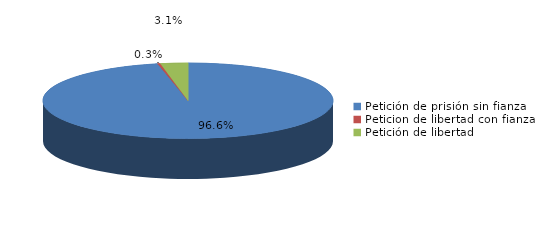
| Category | Series 0 |
|---|---|
| Petición de prisión sin fianza | 600 |
| Peticion de libertad con fianza | 2 |
| Petición de libertad | 19 |